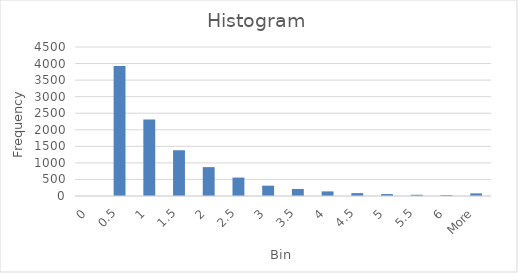
| Category | Series 0 |
|---|---|
| 0 | 0 |
| 0.5 | 3927 |
| 1 | 2310 |
| 1.5 | 1382 |
| 2 | 872 |
| 2.5 | 556 |
| 3 | 312 |
| 3.5 | 213 |
| 4 | 139 |
| 4.5 | 87 |
| 5 | 58 |
| 5.5 | 37 |
| 6 | 28 |
| More | 79 |